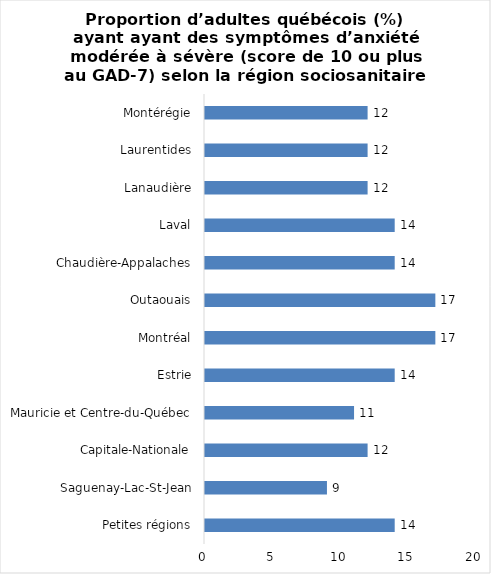
| Category | Series 0 |
|---|---|
| Petites régions | 14 |
| Saguenay-Lac-St-Jean | 9 |
| Capitale-Nationale | 12 |
| Mauricie et Centre-du-Québec | 11 |
| Estrie | 14 |
| Montréal | 17 |
| Outaouais | 17 |
| Chaudière-Appalaches | 14 |
| Laval | 14 |
| Lanaudière | 12 |
| Laurentides | 12 |
| Montérégie | 12 |